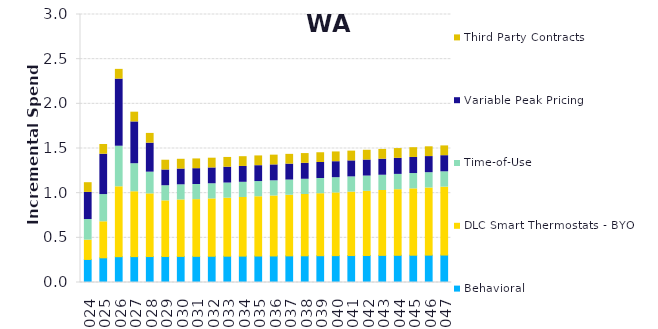
| Category | Behavioral | DLC Smart Thermostats - BYOT | Time-of-Use | Variable Peak Pricing | Third Party Contracts |
|---|---|---|---|---|---|
| 2024.0 | 0.258 | 0.216 | 0.231 | 0.303 | 0.109 |
| 2025.0 | 0.276 | 0.403 | 0.305 | 0.452 | 0.109 |
| 2026.0 | 0.289 | 0.782 | 0.454 | 0.751 | 0.109 |
| 2027.0 | 0.29 | 0.726 | 0.314 | 0.468 | 0.109 |
| 2028.0 | 0.291 | 0.702 | 0.243 | 0.324 | 0.109 |
| 2029.0 | 0.291 | 0.622 | 0.169 | 0.176 | 0.109 |
| 2030.0 | 0.292 | 0.632 | 0.169 | 0.177 | 0.109 |
| 2031.0 | 0.293 | 0.635 | 0.17 | 0.177 | 0.109 |
| 2032.0 | 0.294 | 0.642 | 0.17 | 0.177 | 0.109 |
| 2033.0 | 0.295 | 0.649 | 0.17 | 0.177 | 0.109 |
| 2034.0 | 0.295 | 0.656 | 0.17 | 0.177 | 0.109 |
| 2035.0 | 0.296 | 0.664 | 0.17 | 0.178 | 0.109 |
| 2036.0 | 0.297 | 0.671 | 0.17 | 0.178 | 0.109 |
| 2037.0 | 0.298 | 0.679 | 0.17 | 0.178 | 0.109 |
| 2038.0 | 0.299 | 0.686 | 0.17 | 0.178 | 0.109 |
| 2039.0 | 0.3 | 0.694 | 0.171 | 0.179 | 0.109 |
| 2040.0 | 0.301 | 0.702 | 0.171 | 0.179 | 0.109 |
| 2041.0 | 0.302 | 0.71 | 0.171 | 0.179 | 0.109 |
| 2042.0 | 0.303 | 0.718 | 0.171 | 0.179 | 0.109 |
| 2043.0 | 0.303 | 0.726 | 0.171 | 0.18 | 0.109 |
| 2044.0 | 0.304 | 0.734 | 0.171 | 0.18 | 0.109 |
| 2045.0 | 0.305 | 0.743 | 0.172 | 0.18 | 0.109 |
| 2046.0 | 0.306 | 0.751 | 0.172 | 0.18 | 0.109 |
| 2047.0 | 0.307 | 0.76 | 0.172 | 0.181 | 0.109 |